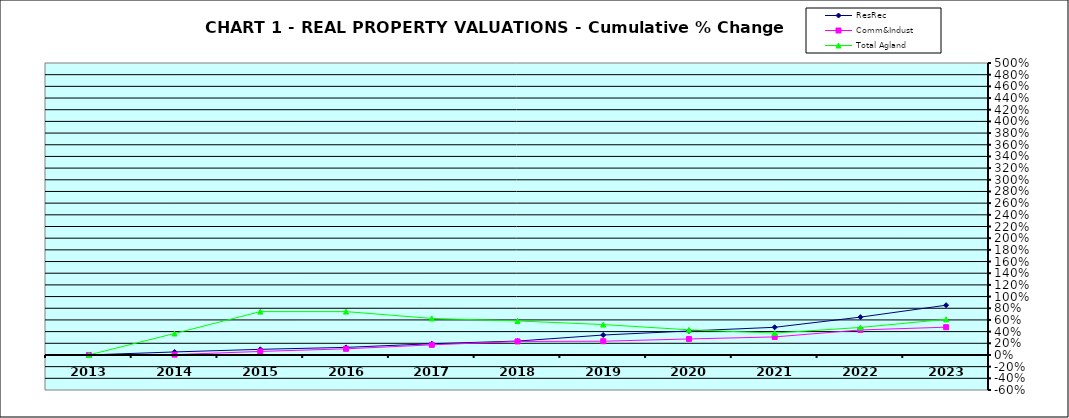
| Category | ResRec | Comm&Indust | Total Agland |
|---|---|---|---|
| 2013.0 | 0 | 0 | 0 |
| 2014.0 | 0.052 | 0.006 | 0.368 |
| 2015.0 | 0.097 | 0.06 | 0.742 |
| 2016.0 | 0.13 | 0.105 | 0.743 |
| 2017.0 | 0.193 | 0.173 | 0.626 |
| 2018.0 | 0.238 | 0.232 | 0.583 |
| 2019.0 | 0.342 | 0.236 | 0.521 |
| 2020.0 | 0.411 | 0.274 | 0.431 |
| 2021.0 | 0.474 | 0.309 | 0.375 |
| 2022.0 | 0.648 | 0.428 | 0.471 |
| 2023.0 | 0.852 | 0.476 | 0.61 |